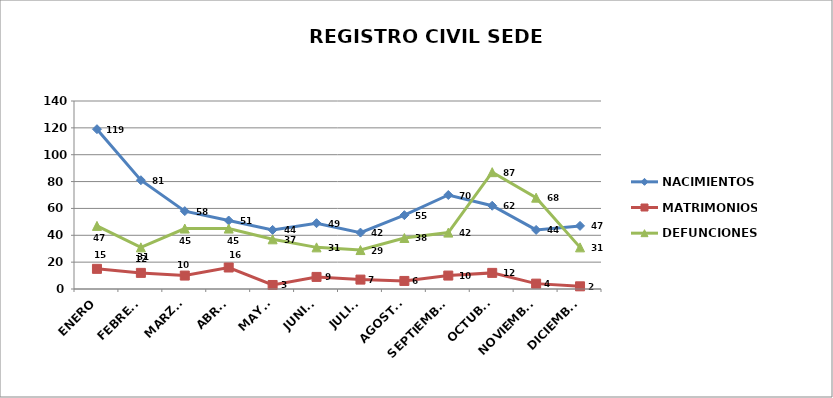
| Category | NACIMIENTOS | MATRIMONIOS | DEFUNCIONES |
|---|---|---|---|
| ENERO | 119 | 15 | 47 |
| FEBRERO | 81 | 12 | 31 |
| MARZO | 58 | 10 | 45 |
| ABRIL | 51 | 16 | 45 |
| MAYO | 44 | 3 | 37 |
| JUNIO | 49 | 9 | 31 |
| JULIO | 42 | 7 | 29 |
| AGOSTO | 55 | 6 | 38 |
| SEPTIEMBRE | 70 | 10 | 42 |
| OCTUBRE | 62 | 12 | 87 |
| NOVIEMBRE | 44 | 4 | 68 |
| DICIEMBRE | 47 | 2 | 31 |